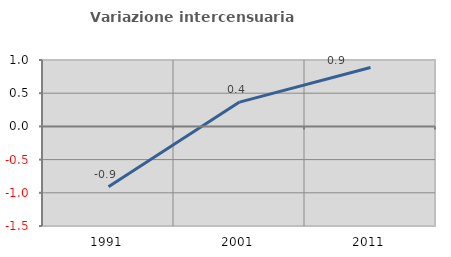
| Category | Variazione intercensuaria annua |
|---|---|
| 1991.0 | -0.91 |
| 2001.0 | 0.366 |
| 2011.0 | 0.887 |